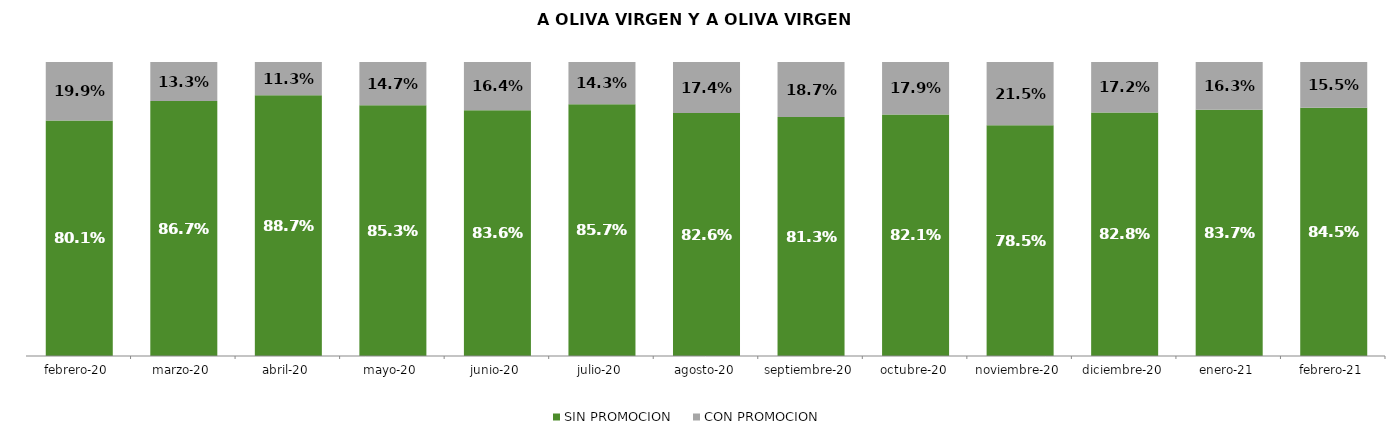
| Category | SIN PROMOCION   | CON PROMOCION   |
|---|---|---|
| 2020-02-01 | 0.801 | 0.199 |
| 2020-03-01 | 0.867 | 0.133 |
| 2020-04-01 | 0.887 | 0.113 |
| 2020-05-01 | 0.853 | 0.147 |
| 2020-06-01 | 0.836 | 0.164 |
| 2020-07-01 | 0.857 | 0.143 |
| 2020-08-01 | 0.826 | 0.174 |
| 2020-09-01 | 0.813 | 0.187 |
| 2020-10-01 | 0.821 | 0.179 |
| 2020-11-01 | 0.785 | 0.215 |
| 2020-12-01 | 0.828 | 0.172 |
| 2021-01-01 | 0.837 | 0.163 |
| 2021-02-01 | 0.845 | 0.155 |